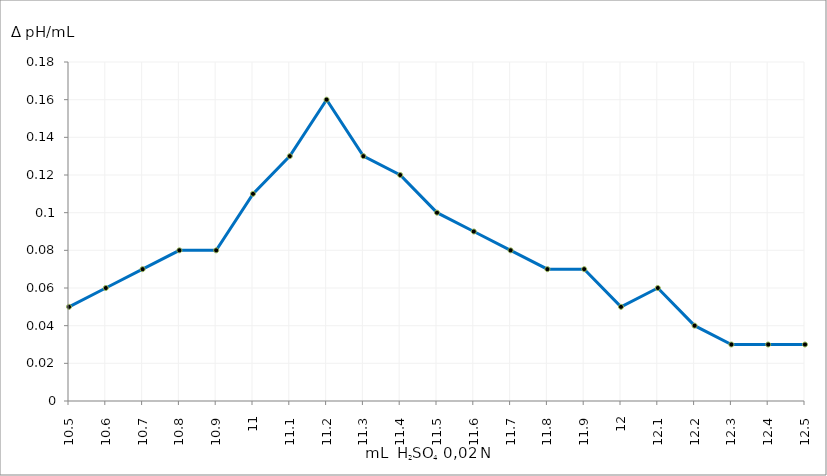
| Category | Series 2 |
|---|---|
| 10.5 | 0.05 |
| 10.6 | 0.06 |
| 10.7 | 0.07 |
| 10.8 | 0.08 |
| 10.9 | 0.08 |
| 11.0 | 0.11 |
| 11.1 | 0.13 |
| 11.2 | 0.16 |
| 11.3 | 0.13 |
| 11.4 | 0.12 |
| 11.5 | 0.1 |
| 11.6 | 0.09 |
| 11.7 | 0.08 |
| 11.8 | 0.07 |
| 11.9 | 0.07 |
| 12.0 | 0.05 |
| 12.1 | 0.06 |
| 12.2 | 0.04 |
| 12.3 | 0.03 |
| 12.4 | 0.03 |
| 12.5 | 0.03 |